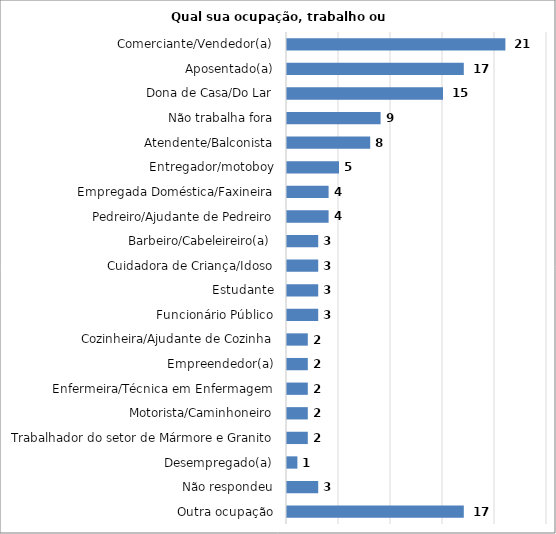
| Category | Series 0 |
|---|---|
| Outra ocupação | 17 |
| Não respondeu | 3 |
| Desempregado(a) | 1 |
| Trabalhador do setor de Mármore e Granito | 2 |
| Motorista/Caminhoneiro | 2 |
| Enfermeira/Técnica em Enfermagem | 2 |
| Empreendedor(a) | 2 |
| Cozinheira/Ajudante de Cozinha | 2 |
| Funcionário Público | 3 |
| Estudante | 3 |
| Cuidadora de Criança/Idoso | 3 |
| Barbeiro/Cabeleireiro(a) | 3 |
| Pedreiro/Ajudante de Pedreiro | 4 |
| Empregada Doméstica/Faxineira | 4 |
| Entregador/motoboy | 5 |
| Atendente/Balconista | 8 |
| Não trabalha fora | 9 |
| Dona de Casa/Do Lar | 15 |
| Aposentado(a) | 17 |
| Comerciante/Vendedor(a) | 21 |